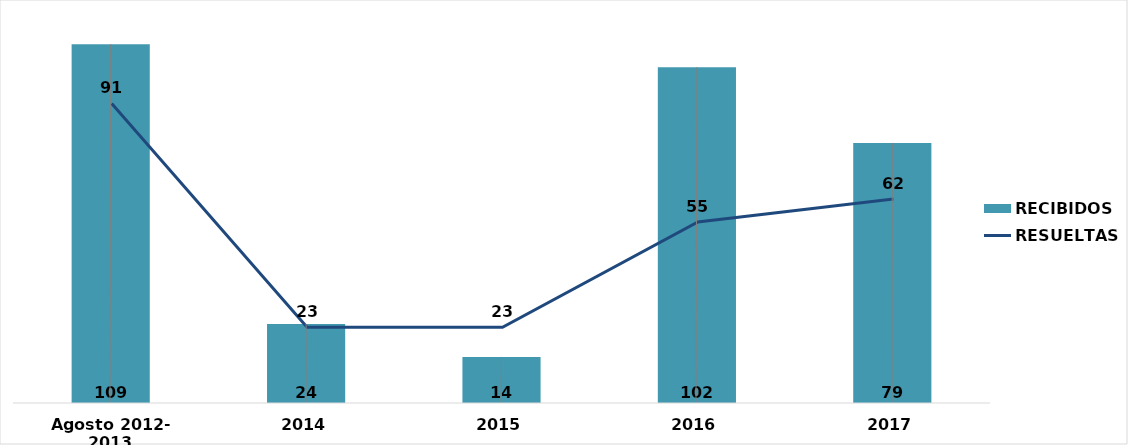
| Category | RECIBIDOS |
|---|---|
| Agosto 2012- 2013 | 109 |
| 2014 | 24 |
| 2015 | 14 |
| 2016 | 102 |
| 2017 | 79 |